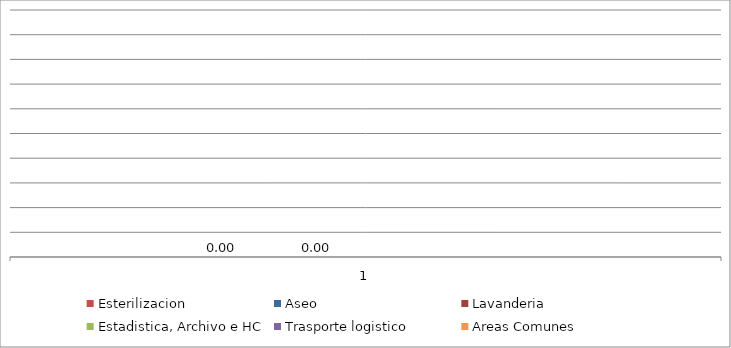
| Category | Esterilizacion  | Aseo | Lavanderia  | Series 4 | Estadistica, Archivo e HC | Trasporte logistico  | Areas Comunes |
|---|---|---|---|---|---|---|---|
| 0 | 0 | 0 | 0 |  | 0 | 0 | 0 |